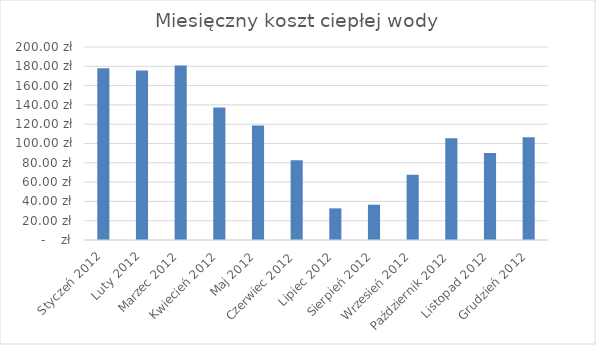
| Category | Series 0 |
|---|---|
| Styczeń 2012 | 178.059 |
| Luty 2012 | 175.68 |
| Marzec 2012 | 180.895 |
| Kwiecień 2012 | 137.268 |
| Maj 2012 | 118.749 |
| Czerwiec 2012 | 82.551 |
| Lipiec 2012 | 32.791 |
| Sierpień 2012 | 36.602 |
| Wrzesień 2012 | 67.665 |
| Październik 2012 | 105.432 |
| Listopad 2012 | 90.255 |
| Grudzień 2012 | 106.453 |